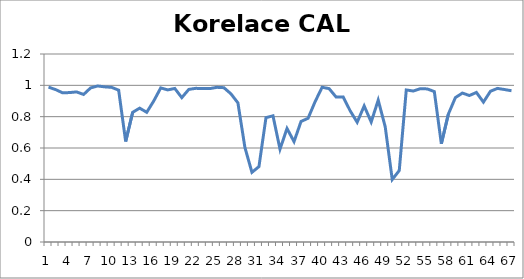
| Category | Korelace CAL 15 |
|---|---|
| 0 | 0.988 |
| 1 | 0.973 |
| 2 | 0.952 |
| 3 | 0.954 |
| 4 | 0.958 |
| 5 | 0.942 |
| 6 | 0.984 |
| 7 | 0.996 |
| 8 | 0.99 |
| 9 | 0.987 |
| 10 | 0.969 |
| 11 | 0.641 |
| 12 | 0.828 |
| 13 | 0.854 |
| 14 | 0.828 |
| 15 | 0.9 |
| 16 | 0.984 |
| 17 | 0.971 |
| 18 | 0.98 |
| 19 | 0.921 |
| 20 | 0.974 |
| 21 | 0.981 |
| 22 | 0.979 |
| 23 | 0.979 |
| 24 | 0.987 |
| 25 | 0.985 |
| 26 | 0.946 |
| 27 | 0.888 |
| 28 | 0.603 |
| 29 | 0.445 |
| 30 | 0.481 |
| 31 | 0.794 |
| 32 | 0.805 |
| 33 | 0.593 |
| 34 | 0.725 |
| 35 | 0.641 |
| 36 | 0.77 |
| 37 | 0.79 |
| 38 | 0.895 |
| 39 | 0.987 |
| 40 | 0.979 |
| 41 | 0.925 |
| 42 | 0.926 |
| 43 | 0.838 |
| 44 | 0.764 |
| 45 | 0.868 |
| 46 | 0.766 |
| 47 | 0.906 |
| 48 | 0.735 |
| 49 | 0.399 |
| 50 | 0.456 |
| 51 | 0.97 |
| 52 | 0.964 |
| 53 | 0.979 |
| 54 | 0.977 |
| 55 | 0.96 |
| 56 | 0.627 |
| 57 | 0.816 |
| 58 | 0.922 |
| 59 | 0.951 |
| 60 | 0.935 |
| 61 | 0.955 |
| 62 | 0.893 |
| 63 | 0.962 |
| 64 | 0.98 |
| 65 | 0.973 |
| 66 | 0.965 |